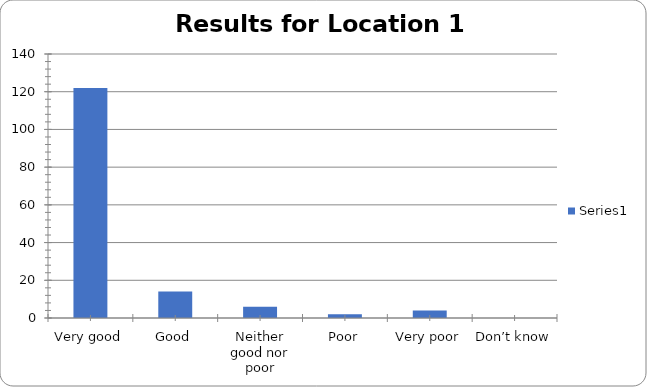
| Category | Series 0 |
|---|---|
| Very good | 122 |
| Good | 14 |
| Neither good nor poor | 6 |
| Poor | 2 |
| Very poor | 4 |
| Don’t know | 0 |